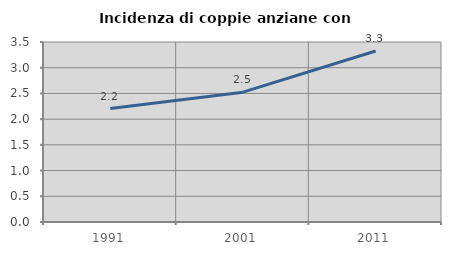
| Category | Incidenza di coppie anziane con figli |
|---|---|
| 1991.0 | 2.205 |
| 2001.0 | 2.525 |
| 2011.0 | 3.325 |